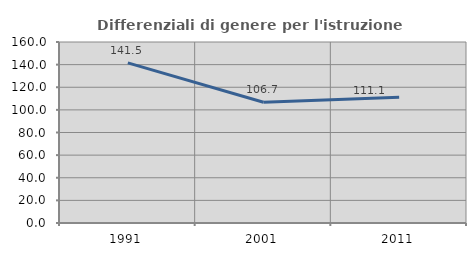
| Category | Differenziali di genere per l'istruzione superiore |
|---|---|
| 1991.0 | 141.503 |
| 2001.0 | 106.724 |
| 2011.0 | 111.111 |